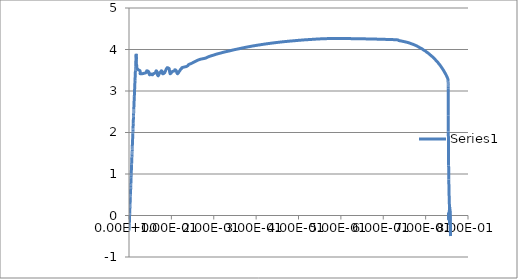
| Category | Series 0 |
|---|---|
| 9.62e-05 | -0.36 |
| 0.000192119 | -0.335 |
| 0.00027776 | -0.31 |
| 0.000399655 | -0.284 |
| 0.000458495 | -0.259 |
| 0.000571577 | -0.233 |
| 0.000683135 | -0.208 |
| 0.000814329 | -0.183 |
| 0.000896132 | -0.158 |
| 0.001006591 | -0.132 |
| 0.001078351 | -0.107 |
| 0.001163689 | -0.082 |
| 0.001247243 | -0.056 |
| 0.001317764 | -0.031 |
| 0.001417679 | -0.006 |
| 0.001545618 | 0.02 |
| 0.001612933 | 0.045 |
| 0.001695872 | 0.071 |
| 0.001821647 | 0.096 |
| 0.001924485 | 0.121 |
| 0.002003952 | 0.147 |
| 0.002082883 | 0.172 |
| 0.002162852 | 0.197 |
| 0.002308945 | 0.222 |
| 0.002380882 | 0.248 |
| 0.00249969 | 0.273 |
| 0.002607998 | 0.298 |
| 0.002706687 | 0.324 |
| 0.002817574 | 0.349 |
| 0.002895739 | 0.374 |
| 0.002966731 | 0.4 |
| 0.003077621 | 0.425 |
| 0.00321436 | 0.45 |
| 0.003249893 | 0.476 |
| 0.003344748 | 0.501 |
| 0.003450474 | 0.526 |
| 0.003546763 | 0.552 |
| 0.003639158 | 0.578 |
| 0.003764751 | 0.603 |
| 0.003846725 | 0.629 |
| 0.003911317 | 0.654 |
| 0.004028241 | 0.68 |
| 0.004127787 | 0.705 |
| 0.004237417 | 0.73 |
| 0.004299086 | 0.755 |
| 0.004447169 | 0.781 |
| 0.004505578 | 0.806 |
| 0.004599708 | 0.831 |
| 0.00472833 | 0.857 |
| 0.004778926 | 0.882 |
| 0.004883092 | 0.907 |
| 0.004977342 | 0.932 |
| 0.00511143 | 0.958 |
| 0.005169113 | 0.983 |
| 0.005277615 | 1.008 |
| 0.005386281 | 1.033 |
| 0.005490898 | 1.059 |
| 0.005587385 | 1.084 |
| 0.005679155 | 1.109 |
| 0.005767832 | 1.134 |
| 0.005854552 | 1.16 |
| 0.005978595 | 1.185 |
| 0.006061065 | 1.211 |
| 0.006121013 | 1.236 |
| 0.006238315 | 1.262 |
| 0.006351213 | 1.288 |
| 0.006433282 | 1.313 |
| 0.006587921 | 1.338 |
| 0.006673934 | 1.364 |
| 0.006709772 | 1.389 |
| 0.006824441 | 1.415 |
| 0.006931766 | 1.44 |
| 0.00708492 | 1.465 |
| 0.007155164 | 1.491 |
| 0.00721828 | 1.516 |
| 0.007349772 | 1.541 |
| 0.007442107 | 1.567 |
| 0.007519739 | 1.592 |
| 0.007643731 | 1.618 |
| 0.007774293 | 1.643 |
| 0.007844056 | 1.669 |
| 0.007929158 | 1.694 |
| 0.008023776 | 1.719 |
| 0.008154605 | 1.745 |
| 0.008247596 | 1.77 |
| 0.008317082 | 1.796 |
| 0.008428085 | 1.821 |
| 0.008535345 | 1.846 |
| 0.008631626 | 1.871 |
| 0.008712258 | 1.897 |
| 0.008814707 | 1.922 |
| 0.008898599 | 1.947 |
| 0.009028257 | 1.973 |
| 0.009094928 | 1.998 |
| 0.00922012 | 2.023 |
| 0.009308427 | 2.049 |
| 0.009388837 | 2.075 |
| 0.009523281 | 2.1 |
| 0.00963162 | 2.125 |
| 0.009728574 | 2.15 |
| 0.009842557 | 2.175 |
| 0.009918951 | 2.201 |
| 0.009982383 | 2.226 |
| 0.010081283 | 2.251 |
| 0.010151845 | 2.276 |
| 0.010290972 | 2.301 |
| 0.010386358 | 2.326 |
| 0.010473859 | 2.352 |
| 0.010635167 | 2.378 |
| 0.010705587 | 2.403 |
| 0.010785545 | 2.428 |
| 0.010891894 | 2.453 |
| 0.010953717 | 2.479 |
| 0.011084596 | 2.504 |
| 0.011219368 | 2.529 |
| 0.011297473 | 2.554 |
| 0.011375923 | 2.58 |
| 0.011487489 | 2.605 |
| 0.011584476 | 2.63 |
| 0.011721656 | 2.656 |
| 0.011808499 | 2.681 |
| 0.011922851 | 2.706 |
| 0.011999734 | 2.732 |
| 0.012091384 | 2.757 |
| 0.012218266 | 2.782 |
| 0.012316401 | 2.807 |
| 0.01235942 | 2.832 |
| 0.012490259 | 2.858 |
| 0.012630473 | 2.883 |
| 0.012719618 | 2.908 |
| 0.012821739 | 2.934 |
| 0.012935468 | 2.959 |
| 0.013026878 | 2.984 |
| 0.013134837 | 3.01 |
| 0.013261844 | 3.035 |
| 0.013362354 | 3.06 |
| 0.013447898 | 3.085 |
| 0.013569247 | 3.111 |
| 0.013667205 | 3.136 |
| 0.013784644 | 3.161 |
| 0.013875623 | 3.186 |
| 0.01399216 | 3.212 |
| 0.014113602 | 3.237 |
| 0.014225434 | 3.262 |
| 0.014283937 | 3.287 |
| 0.014417921 | 3.312 |
| 0.014505481 | 3.338 |
| 0.014599823 | 3.363 |
| 0.014735528 | 3.388 |
| 0.014822433 | 3.413 |
| 0.014954172 | 3.439 |
| 0.015055911 | 3.464 |
| 0.015182446 | 3.49 |
| 0.015248951 | 3.515 |
| 0.015392003 | 3.541 |
| 0.015577399 | 3.566 |
| 0.015667971 | 3.591 |
| 0.015767938 | 3.617 |
| 0.015857078 | 3.643 |
| 0.01596847 | 3.668 |
| 0.016058888 | 3.693 |
| 0.016195053 | 3.719 |
| 0.016300451 | 3.744 |
| 0.016387774 | 3.769 |
| 0.016526809 | 3.794 |
| 0.016628766 | 3.82 |
| 0.016745452 | 3.845 |
| 0.016840514 | 3.87 |
| 0.016983615 | 3.895 |
| 0.017171031 | 3.87 |
| 0.017284337 | 3.844 |
| 0.017374091 | 3.818 |
| 0.017498793 | 3.793 |
| 0.017573688 | 3.767 |
| 0.017618317 | 3.742 |
| 0.017699575 | 3.716 |
| 0.017747821 | 3.691 |
| 0.017860251 | 3.665 |
| 0.017971119 | 3.64 |
| 0.018092766 | 3.615 |
| 0.01830885 | 3.59 |
| 0.018620074 | 3.564 |
| 0.019267501 | 3.539 |
| 0.02147902 | 3.514 |
| 0.025923342 | 3.489 |
| 0.026321232 | 3.464 |
| 0.026726779 | 3.438 |
| 0.027152315 | 3.413 |
| 0.039636113 | 3.438 |
| 0.041104242 | 3.463 |
| 0.042028844 | 3.489 |
| 0.046527039 | 3.463 |
| 0.0470208 | 3.438 |
| 0.047507517 | 3.413 |
| 0.048696164 | 3.388 |
| 0.050934549 | 3.413 |
| 0.054955371 | 3.388 |
| 0.057120781 | 3.413 |
| 0.062319405 | 3.438 |
| 0.063213542 | 3.463 |
| 0.064086825 | 3.489 |
| 0.066381909 | 3.463 |
| 0.066617608 | 3.438 |
| 0.06691128 | 3.413 |
| 0.067228682 | 3.388 |
| 0.068697564 | 3.363 |
| 0.070115097 | 3.388 |
| 0.071280673 | 3.413 |
| 0.07295759 | 3.438 |
| 0.074692428 | 3.463 |
| 0.076271735 | 3.488 |
| 0.078764603 | 3.463 |
| 0.079246424 | 3.438 |
| 0.079763971 | 3.413 |
| 0.084030919 | 3.438 |
| 0.085105106 | 3.463 |
| 0.086354487 | 3.488 |
| 0.087227196 | 3.513 |
| 0.088576876 | 3.538 |
| 0.090456672 | 3.563 |
| 0.094870217 | 3.538 |
| 0.095208302 | 3.513 |
| 0.095523305 | 3.488 |
| 0.09597367 | 3.463 |
| 0.09641137 | 3.438 |
| 0.097163565 | 3.413 |
| 0.099910364 | 3.438 |
| 0.10114672 | 3.463 |
| 0.10715062 | 3.488 |
| 0.10827156 | 3.513 |
| 0.11160935 | 3.488 |
| 0.11221822 | 3.463 |
| 0.11287951 | 3.438 |
| 0.11447015 | 3.413 |
| 0.11651328 | 3.438 |
| 0.11802726 | 3.463 |
| 0.11982536 | 3.488 |
| 0.12114228 | 3.513 |
| 0.12385099 | 3.538 |
| 0.12506667 | 3.563 |
| 0.13484721 | 3.589 |
| 0.13924131 | 3.614 |
| 0.14095473 | 3.639 |
| 0.1471312 | 3.664 |
| 0.15177205 | 3.689 |
| 0.15648578 | 3.714 |
| 0.16156353 | 3.739 |
| 0.16802566 | 3.764 |
| 0.17952643 | 3.789 |
| 0.18505116 | 3.814 |
| 0.19140713 | 3.839 |
| 0.19932735 | 3.864 |
| 0.20694754 | 3.889 |
| 0.21623479 | 3.914 |
| 0.22517702 | 3.939 |
| 0.23618402 | 3.964 |
| 0.24602595 | 3.989 |
| 0.25788119 | 4.014 |
| 0.2690348 | 4.039 |
| 0.28139514 | 4.064 |
| 0.29479516 | 4.089 |
| 0.30990189 | 4.115 |
| 0.32652175 | 4.14 |
| 0.34533197 | 4.165 |
| 0.36694482 | 4.19 |
| 0.39351285 | 4.215 |
| 0.42562008 | 4.24 |
| 0.48286524 | 4.265 |
| 0.61903179 | 4.24 |
| 0.63724989 | 4.215 |
| 0.64938825 | 4.19 |
| 0.65933621 | 4.165 |
| 0.6661467 | 4.139 |
| 0.67282939 | 4.114 |
| 0.67817086 | 4.089 |
| 0.68289727 | 4.064 |
| 0.68678516 | 4.039 |
| 0.69177568 | 4.014 |
| 0.69496876 | 3.989 |
| 0.69918913 | 3.964 |
| 0.70218056 | 3.939 |
| 0.7058292 | 3.914 |
| 0.70879966 | 3.889 |
| 0.71157026 | 3.864 |
| 0.71457571 | 3.839 |
| 0.71716374 | 3.814 |
| 0.71979952 | 3.789 |
| 0.72208869 | 3.764 |
| 0.72437483 | 3.738 |
| 0.72664905 | 3.713 |
| 0.72888809 | 3.688 |
| 0.73064399 | 3.663 |
| 0.73265916 | 3.638 |
| 0.73469657 | 3.613 |
| 0.73640943 | 3.588 |
| 0.73800844 | 3.563 |
| 0.73961169 | 3.538 |
| 0.74126798 | 3.513 |
| 0.74277657 | 3.488 |
| 0.74418956 | 3.463 |
| 0.74555552 | 3.438 |
| 0.74698359 | 3.413 |
| 0.74829739 | 3.387 |
| 0.74948627 | 3.362 |
| 0.75064576 | 3.337 |
| 0.75169247 | 3.312 |
| 0.75253481 | 3.287 |
| 0.75291425 | 3.262 |
| 0.75300682 | 3.236 |
| 0.7531094 | 3.21 |
| 0.75315773 | 3.185 |
| 0.75315326 | 3.159 |
| 0.75321966 | 3.129 |
| 0.75320959 | 3.102 |
| 0.75328171 | 3.053 |
| 0.75332665 | 3.002 |
| 0.75335294 | 2.902 |
| 0.75337899 | 2.713 |
| 0.75345397 | 2.413 |
| 0.75362223 | 2.024 |
| 0.75389057 | 1.603 |
| 0.75424379 | 1.207 |
| 0.75467306 | 0.868 |
| 0.75516963 | 0.592 |
| 0.75571406 | 0.375 |
| 0.75628114 | 0.206 |
| 0.75684375 | 0.068 |
| 0.75737464 | -0.061 |
| 0.75784749 | -0.2 |
| 0.75823361 | -0.348 |
| 0.7585054 | -0.463 |
| 0.75864494 | -0.496 |
| 0.75864881 | -0.431 |
| 0.75852835 | -0.298 |
| 0.7582953 | -0.147 |
| 0.75796407 | -0.009 |
| 0.75757456 | 0.099 |
| 0.75717366 | 0.17 |
| 0.75678253 | 0.197 |
| 0.75607359 | 0.129 |
| 0.7558037 | 0.074 |
| 0.75562197 | 0.042 |
| 0.75574738 | 0.007 |
| 0.75593346 | -0.054 |
| 0.75615877 | -0.122 |
| 0.7564137 | -0.183 |
| 0.75667298 | -0.225 |
| 0.75717521 | -0.124 |
| 0.75718957 | -0.018 |
| 0.75712961 | 0.073 |
| 0.75699753 | 0.11 |
| 0.7565695 | 0.032 |
| 0.75631887 | -0.018 |
| 0.75606239 | -0.048 |
| 0.75499004 | -0.003 |
| 0.7549023 | -0.078 |
| 0.75496244 | -0.113 |
| 0.75515634 | -0.07 |
| 0.7552669 | -0.025 |
| 0.75538927 | 0.014 |
| 0.75552744 | 0.046 |
| 0.75567025 | 0.075 |
| 0.75590253 | 0.027 |
| 0.75586993 | -0.019 |
| 0.75514531 | -0.06 |
| 0.75484049 | -0.099 |
| 0.75452292 | -0.032 |
| 0.75451887 | 0.02 |
| 0.75452697 | 0.065 |
| 0.75469142 | 0.017 |
| 0.75477099 | -0.015 |
| 0.75485235 | -0.043 |
| 0.75493234 | -0.07 |
| 0.75479341 | -0.042 |
| 0.75462139 | -0.076 |
| 0.75428194 | -0.048 |
| 0.75407118 | -0.009 |
| 0.75394136 | 0.033 |
| 0.75408792 | 0.006 |
| 0.75418562 | -0.021 |
| 0.75429231 | -0.053 |
| 0.75439054 | -0.079 |
| 0.75448066 | -0.042 |
| 0.75442195 | -0.014 |
| 0.75434566 | 0.022 |
| 0.75425011 | 0.055 |
| 0.75388628 | 0.022 |
| 0.75399399 | -0.006 |
| 0.75413173 | -0.032 |
| 0.7541827 | -0.076 |
| 0.75412959 | -0.039 |
| 0.75409514 | -0.01 |
| 0.75398302 | 0.022 |
| 0.75375247 | -0.012 |
| 0.75369239 | -0.042 |
| 0.75375158 | -0.071 |
| 0.75392008 | -0.036 |
| 0.75398678 | 0.002 |
| 0.75384533 | -0.033 |
| 0.75400782 | 0.005 |
| 0.75376487 | -0.023 |
| 0.75382107 | 0.003 |
| 0.75375003 | -0.026 |
| 0.75385898 | 0.001 |
| 0.75386602 | -0.025 |
| 0.75382388 | 0.003 |